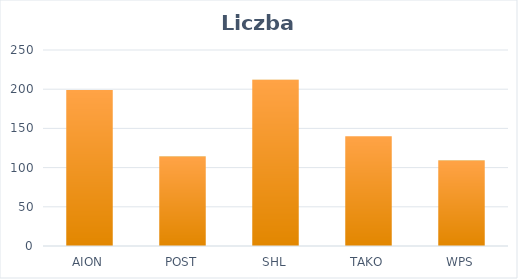
| Category | Suma |
|---|---|
| AION | 199 |
| POST | 114 |
| SHL | 212 |
| TAKO | 140 |
| WPS | 109 |